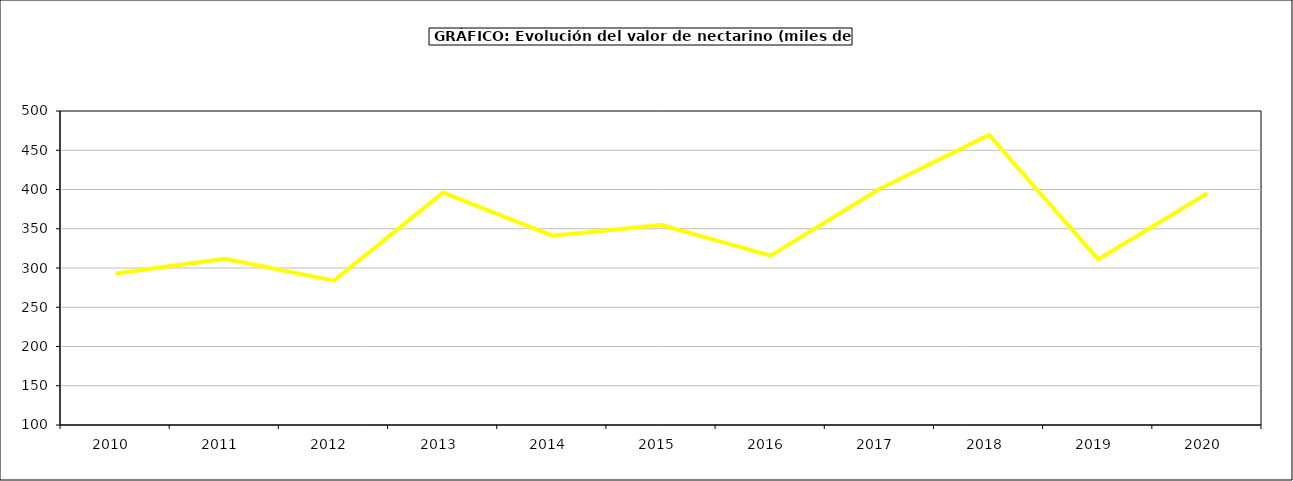
| Category | valor melocotonero |
|---|---|
| 2010.0 | 292.883 |
| 2011.0 | 311.892 |
| 2012.0 | 283.963 |
| 2013.0 | 395.996 |
| 2014.0 | 341.206 |
| 2015.0 | 354.8 |
| 2016.0 | 315.7 |
| 2017.0 | 400.939 |
| 2018.0 | 469.428 |
| 2019.0 | 310.904 |
| 2020.0 | 395.161 |